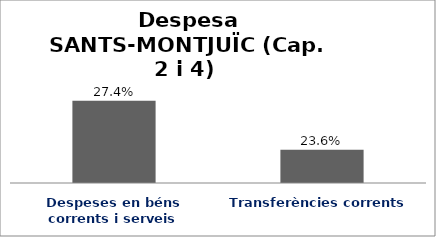
| Category | Series 0 |
|---|---|
| Despeses en béns corrents i serveis | 0.274 |
| Transferències corrents | 0.236 |